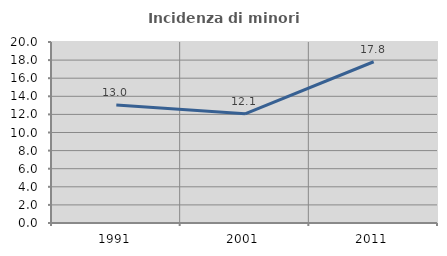
| Category | Incidenza di minori stranieri |
|---|---|
| 1991.0 | 13.043 |
| 2001.0 | 12.069 |
| 2011.0 | 17.816 |